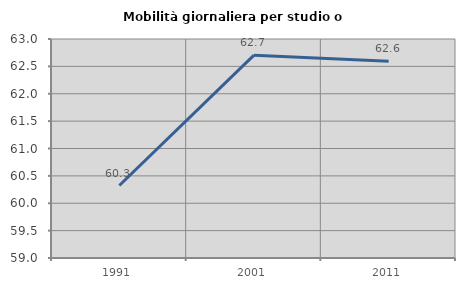
| Category | Mobilità giornaliera per studio o lavoro |
|---|---|
| 1991.0 | 60.324 |
| 2001.0 | 62.704 |
| 2011.0 | 62.596 |